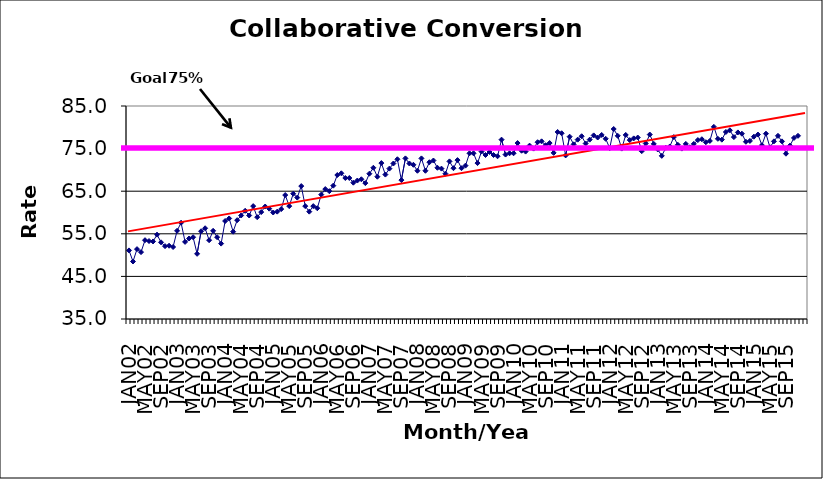
| Category | Series 0 |
|---|---|
| JAN02 | 51.1 |
| FEB02 | 48.5 |
| MAR02 | 51.4 |
| APR02 | 50.7 |
| MAY02 | 53.5 |
| JUN02 | 53.3 |
| JUL02 | 53.2 |
| AUG02 | 54.8 |
| SEP02 | 53 |
| OCT02 | 52.1 |
| NOV02 | 52.2 |
| DEC02 | 51.9 |
| JAN03 | 55.7 |
| FEB03 | 57.6 |
| MAR03 | 53.1 |
| APR03 | 53.9 |
| MAY03 | 54.2 |
| JUN03 | 50.3 |
| JUL03 | 55.6 |
| AUG03 | 56.3 |
| SEP03 | 53.5 |
| OCT03 | 55.7 |
| NOV03 | 54.2 |
| DEC03 | 52.7 |
| JAN04 | 58 |
| FEB04 | 58.6 |
| MAR04 | 55.5 |
| APR04 | 58.2 |
| MAY04 | 59.3 |
| JUN04 | 60.4 |
| JUL04 | 59.3 |
| AUG04 | 61.5 |
| SEP04 | 58.9 |
| OCT04 | 60.1 |
| NOV04 | 61.4 |
| DEC04 | 60.9 |
| JAN05 | 60 |
| FEB05 | 60.2 |
| MAR05 | 60.8 |
| APR05 | 64.1 |
| MAY05 | 61.5 |
| JUN05 | 64.4 |
| JUL05 | 63.5 |
| AUG05 | 66.2 |
| SEP05 | 61.5 |
| OCT05 | 60.2 |
| NOV05 | 61.5 |
| DEC05 | 61 |
| JAN06 | 64.2 |
| FEB06 | 65.5 |
| MAR06 | 65 |
| APR06 | 66.3 |
| MAY06 | 68.8 |
| JUN06 | 69.2 |
| JUL06 | 68.1 |
| AUG06 | 68.1 |
| SEP06 | 67 |
| OCT06 | 67.5 |
| NOV06 | 67.8 |
| DEC06 | 66.9 |
| JAN07 | 69.1 |
| FEB07 | 70.5 |
| MAR07 | 68.4 |
| APR07 | 71.6 |
| MAY07 | 68.9 |
| JUN07 | 70.3 |
| JUL07 | 71.5 |
| AUG07 | 72.5 |
| SEP07 | 67.6 |
| OCT07 | 72.7 |
| NOV07 | 71.5 |
| DEC07 | 71.2 |
| JAN08 | 69.8 |
| FEB08 | 72.7 |
| MAR08 | 69.8 |
| APR08 | 71.8 |
| MAY08 | 72.2 |
| JUN08 | 70.5 |
| JUL08 | 70.3 |
| AUG08 | 69.1 |
| SEP08 | 72 |
| OCT08 | 70.4 |
| NOV08 | 72.3 |
| DEC08 | 70.4 |
| JAN09 | 71 |
| FEB09 | 73.9 |
| MAR09 | 73.9 |
| APR09 | 71.6 |
| MAY09 | 74.3 |
| JUN09 | 73.5 |
| JUL09 | 74.2 |
| AUG09 | 73.5 |
| SEP09 | 73.2 |
| OCT09 | 77.1 |
| NOV09 | 73.6 |
| DEC09 | 73.9 |
| JAN10 | 73.9 |
| FEB10 | 76.3 |
| MAR10 | 74.5 |
| APR10 | 74.3 |
| MAY10 | 75.7 |
| JUN10 | 75 |
| JUL10 | 76.5 |
| AUG10 | 76.7 |
| SEP10 | 75.8 |
| OCT10 | 76.3 |
| NOV10 | 74 |
| DEC10 | 78.9 |
| JAN11 | 78.6 |
| FEB11 | 73.4 |
| MAR11 | 77.8 |
| APR11 | 76 |
| MAY11 | 77.1 |
| JUN11 | 77.9 |
| JUL11 | 76.2 |
| AUG11 | 77.1 |
| SEP11 | 78.1 |
| OCT11 | 77.6 |
| NOV11 | 78.2 |
| DEC11 | 77.3 |
| JAN12 | 75.1 |
| FEB12 | 79.6 |
| MAR12 | 78 |
| APR12 | 75 |
| MAY12 | 78.2 |
| JUN12 | 77 |
| JUL12 | 77.4 |
| AUG12 | 77.6 |
| SEP12 | 74.4 |
| OCT12 | 76.2 |
| NOV12 | 78.3 |
| DEC12 | 76.1 |
| JAN13 | 74.8 |
| FEB13 | 73.3 |
| MAR13 | 75.2 |
| APR13 | 75.5 |
| MAY13 | 77.7 |
| JUN13 | 75.9 |
| JUL13 | 75 |
| AUG13 | 76.1 |
| SEP13 | 75.3 |
| OCT13 | 76.1 |
| NOV13 | 77 |
| DEC13 | 77.2 |
| JAN14 | 76.5 |
| FEB14 | 76.8 |
| MAR14 | 80.1 |
| APR14 | 77.3 |
| MAY14 | 77.1 |
| JUN14 | 78.9 |
| JUL14 | 79.3 |
| AUG14 | 77.7 |
| SEP14 | 78.8 |
| OCT14 | 78.5 |
| NOV14 | 76.6 |
| DEC14 | 76.8 |
| JAN15 | 77.8 |
| FEB15 | 78.3 |
| MAR15 | 75.8 |
| APR15 | 78.5 |
| MAY15 | 75.3 |
| JUN15 | 76.7 |
| JUL15 | 78 |
| AUG15 | 76.7 |
| SEP15 | 73.8 |
| OCT15 | 75.7 |
| NOV15 | 77.5 |
| DEC15 | 78 |